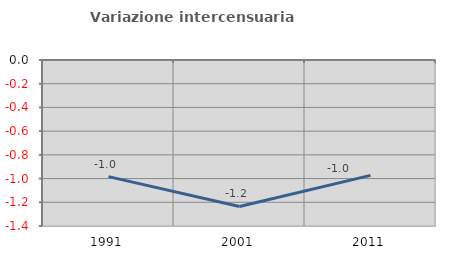
| Category | Variazione intercensuaria annua |
|---|---|
| 1991.0 | -0.984 |
| 2001.0 | -1.235 |
| 2011.0 | -0.973 |